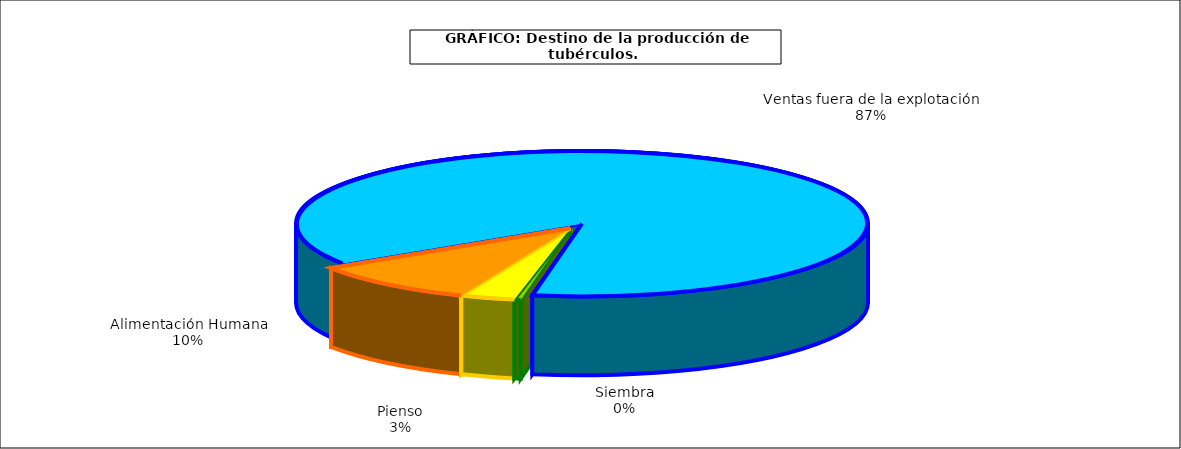
| Category | Series 0 |
|---|---|
| 0 | 8435 |
| 1 | 73110 |
| 2 | 226029 |
| 3 | 2058523 |